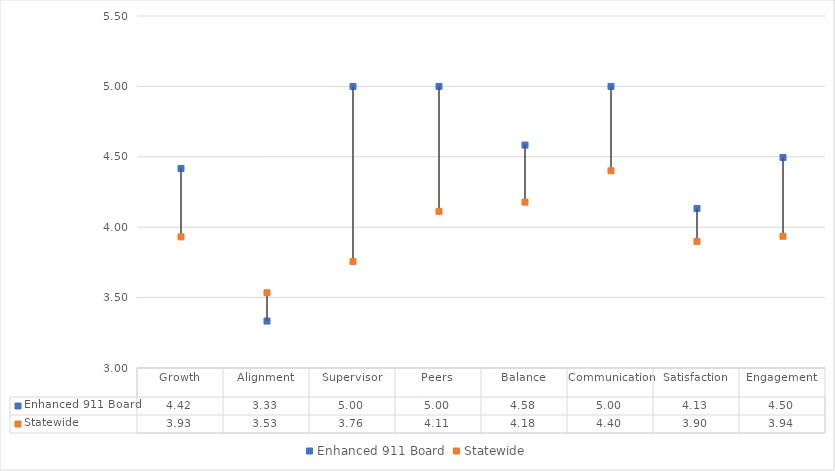
| Category | Enhanced 911 Board | Statewide |
|---|---|---|
| Growth | 4.417 | 3.931 |
| Alignment | 3.333 | 3.534 |
| Supervisor | 5 | 3.756 |
| Peers | 5 | 4.112 |
| Balance | 4.583 | 4.178 |
| Communication | 5 | 4.4 |
| Satisfaction | 4.133 | 3.899 |
| Engagement | 4.495 | 3.936 |